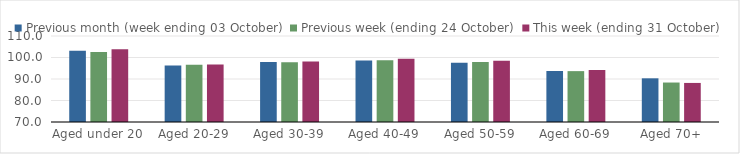
| Category | Previous month (week ending 03 October) | Previous week (ending 24 October) | This week (ending 31 October) |
|---|---|---|---|
| Aged under 20 | 103.09 | 102.61 | 103.86 |
| Aged 20-29 | 96.24 | 96.68 | 96.72 |
| Aged 30-39 | 97.96 | 97.74 | 98.11 |
| Aged 40-49 | 98.55 | 98.73 | 99.39 |
| Aged 50-59 | 97.61 | 97.91 | 98.52 |
| Aged 60-69 | 93.72 | 93.66 | 94.18 |
| Aged 70+ | 90.32 | 88.36 | 88.17 |